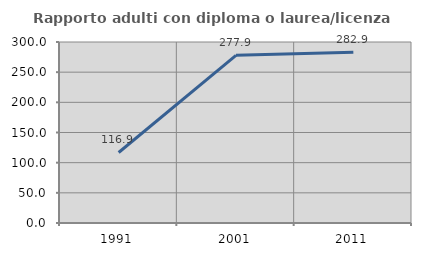
| Category | Rapporto adulti con diploma o laurea/licenza media  |
|---|---|
| 1991.0 | 116.883 |
| 2001.0 | 277.907 |
| 2011.0 | 282.927 |